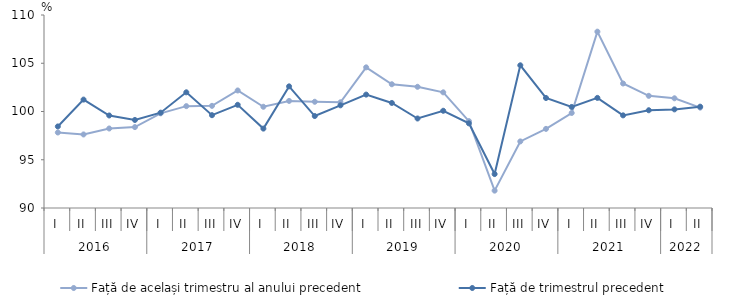
| Category | Față de același trimestru al anului precedent | Față de trimestrul precedent |
|---|---|---|
| 0 | 97.825 | 98.452 |
| 1 | 97.621 | 101.233 |
| 2 | 98.239 | 99.588 |
| 3 | 98.385 | 99.123 |
| 4 | 99.811 | 99.879 |
| 5 | 100.556 | 101.989 |
| 6 | 100.586 | 99.618 |
| 7 | 102.179 | 100.693 |
| 8 | 100.491 | 98.228 |
| 9 | 101.097 | 102.604 |
| 10 | 101.008 | 99.53 |
| 11 | 100.954 | 100.639 |
| 12 | 104.574 | 101.751 |
| 13 | 102.823 | 100.886 |
| 14 | 102.56 | 99.275 |
| 15 | 101.986 | 100.076 |
| 16 | 99 | 98.772 |
| 17 | 91.8 | 93.516 |
| 18 | 96.9 | 104.788 |
| 19 | 98.2 | 101.4 |
| 20 | 99.847 | 100.472 |
| 21 | 108.274 | 101.409 |
| 22 | 102.9 | 99.6 |
| 23 | 101.623 | 100.13 |
| 24 | 101.369 | 100.22 |
| 25 | 100.4 | 100.5 |